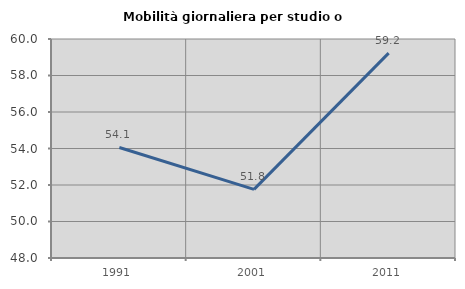
| Category | Mobilità giornaliera per studio o lavoro |
|---|---|
| 1991.0 | 54.057 |
| 2001.0 | 51.762 |
| 2011.0 | 59.227 |